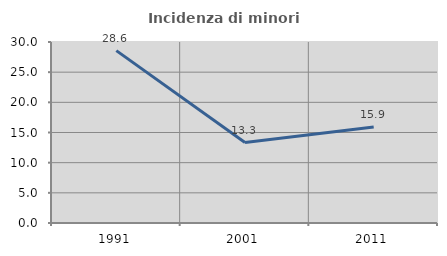
| Category | Incidenza di minori stranieri |
|---|---|
| 1991.0 | 28.571 |
| 2001.0 | 13.333 |
| 2011.0 | 15.909 |